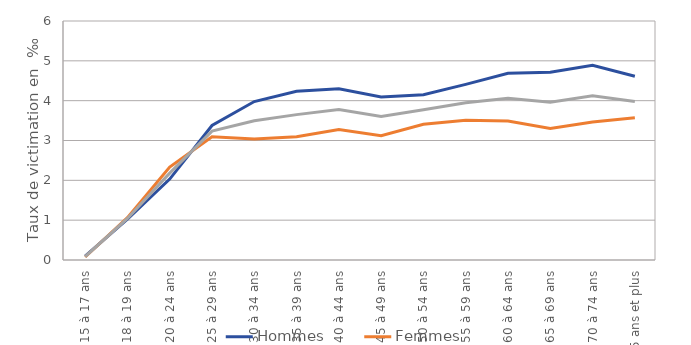
| Category | Hommes | Femmes | Ensemble |
|---|---|---|---|
| 15 à 17 ans | 0.099 | 0.075 | 0.087 |
| 18 à 19 ans | 1.023 | 1.062 | 1.042 |
| 20 à 24 ans | 2.031 | 2.334 | 2.18 |
| 25 à 29 ans | 3.377 | 3.096 | 3.235 |
| 30 à 34 ans | 3.978 | 3.037 | 3.495 |
| 35 à 39 ans | 4.236 | 3.095 | 3.649 |
| 40 à 44 ans | 4.297 | 3.279 | 3.778 |
| 45 à 49 ans | 4.095 | 3.12 | 3.602 |
| 50 à 54 ans | 4.149 | 3.405 | 3.771 |
| 55 à 59 ans | 4.409 | 3.509 | 3.947 |
| 60 à 64 ans | 4.687 | 3.489 | 4.061 |
| 65 à 69 ans | 4.715 | 3.299 | 3.963 |
| 70 à 74 ans | 4.887 | 3.466 | 4.124 |
| 75 ans et plus | 4.614 | 3.573 | 3.981 |